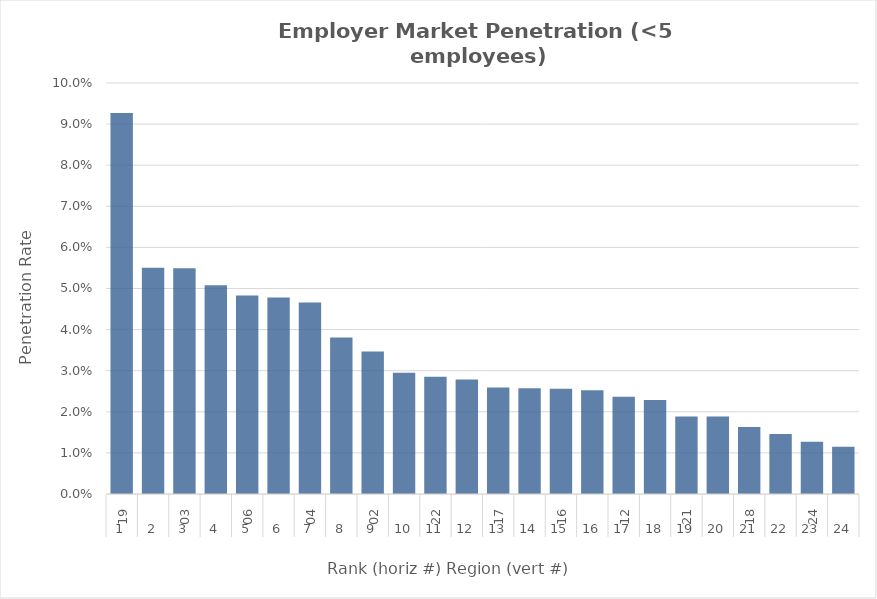
| Category | Rate |
|---|---|
| 0 | 0.093 |
| 1 | 0.055 |
| 2 | 0.055 |
| 3 | 0.051 |
| 4 | 0.048 |
| 5 | 0.048 |
| 6 | 0.047 |
| 7 | 0.038 |
| 8 | 0.035 |
| 9 | 0.029 |
| 10 | 0.029 |
| 11 | 0.028 |
| 12 | 0.026 |
| 13 | 0.026 |
| 14 | 0.026 |
| 15 | 0.025 |
| 16 | 0.024 |
| 17 | 0.023 |
| 18 | 0.019 |
| 19 | 0.019 |
| 20 | 0.016 |
| 21 | 0.015 |
| 22 | 0.013 |
| 23 | 0.011 |